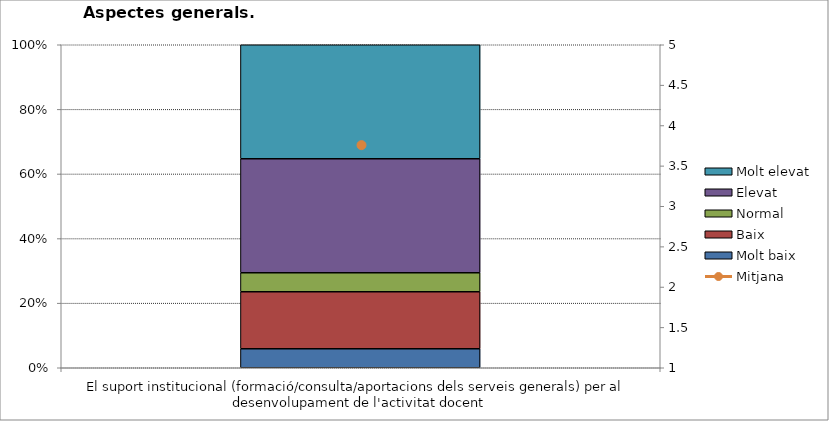
| Category | Molt baix | Baix | Normal  | Elevat | Molt elevat |
|---|---|---|---|---|---|
| El suport institucional (formació/consulta/aportacions dels serveis generals) per al desenvolupament de l'activitat docent | 1 | 3 | 1 | 6 | 6 |